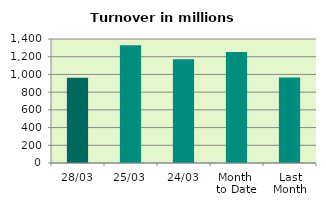
| Category | Series 0 |
|---|---|
| 28/03 | 962.986 |
| 25/03 | 1329.413 |
| 24/03 | 1170.788 |
| Month 
to Date | 1252.893 |
| Last
Month | 966.674 |